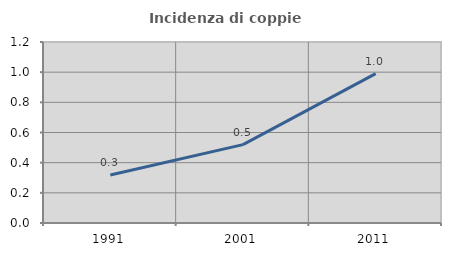
| Category | Incidenza di coppie miste |
|---|---|
| 1991.0 | 0.319 |
| 2001.0 | 0.52 |
| 2011.0 | 0.99 |